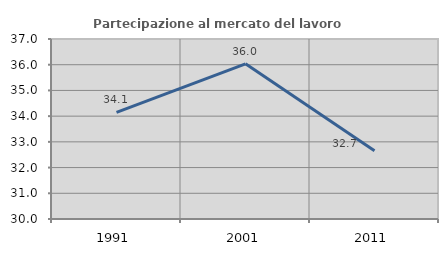
| Category | Partecipazione al mercato del lavoro  femminile |
|---|---|
| 1991.0 | 34.149 |
| 2001.0 | 36.035 |
| 2011.0 | 32.65 |